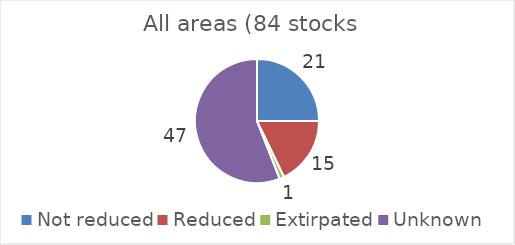
| Category | All areas |
|---|---|
| Not reduced | 21 |
| Reduced | 15 |
| Extirpated | 1 |
| Unknown | 47 |